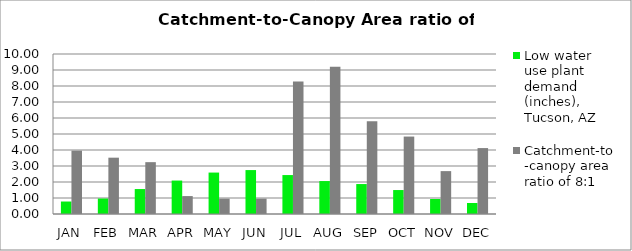
| Category | Low water use plant demand (inches), Tucson, AZ  | Catchment-to-canopy area ratio of 8:1  |
|---|---|---|
| JAN | 0.78 | 3.96 |
| FEB | 0.967 | 3.52 |
| MAR | 1.56 | 3.24 |
| APR | 2.09 | 1.12 |
| MAY | 2.59 | 0.96 |
| JUN | 2.746 | 0.96 |
| JUL | 2.434 | 8.28 |
| AUG | 2.059 | 9.2 |
| SEP | 1.872 | 5.8 |
| OCT | 1.498 | 4.84 |
| NOV | 0.936 | 2.68 |
| DEC | 0.686 | 4.12 |